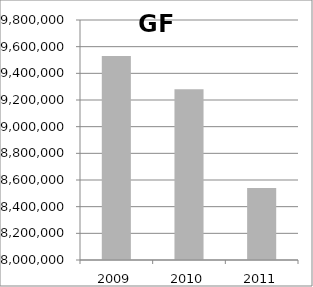
| Category | Series 1 |
|---|---|
| 2009.0 | 9529940 |
| 2010.0 | 9281070 |
| 2011.0 | 8539450.997 |